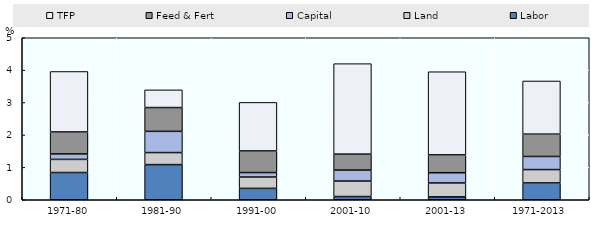
| Category | Labor | Land | Capital | Feed & Fert | TFP |
|---|---|---|---|---|---|
| 1971-80 | 0.841 | 0.405 | 0.168 | 0.678 | 1.866 |
| 1981-90 | 1.085 | 0.371 | 0.655 | 0.735 | 0.546 |
| 1991-00 | 0.351 | 0.351 | 0.137 | 0.668 | 1.497 |
| 2001-10 | 0.098 | 0.479 | 0.338 | 0.493 | 2.792 |
| 2001-13 | 0.089 | 0.429 | 0.316 | 0.551 | 2.567 |
| 1971-2013 | 0.519 | 0.412 | 0.404 | 0.689 | 1.642 |